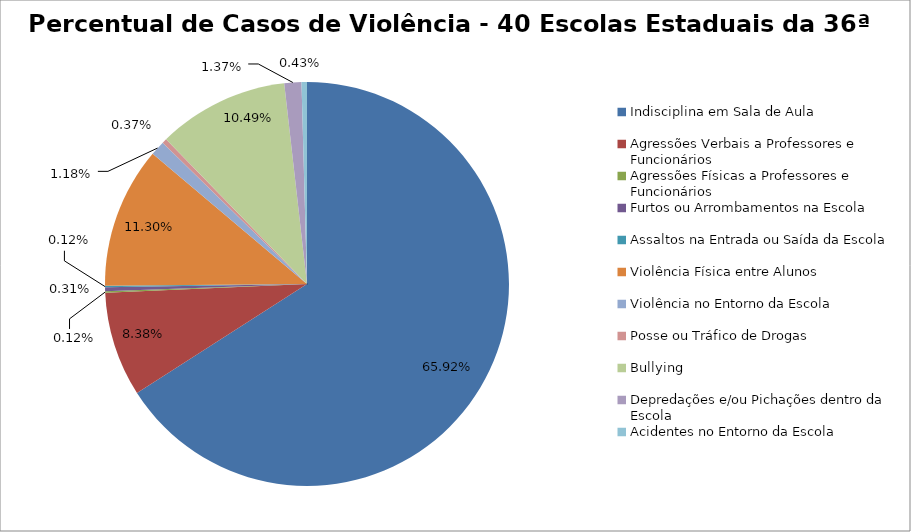
| Category | Percentual |
|---|---|
| Indisciplina em Sala de Aula | 0.659 |
| Agressões Verbais a Professores e Funcionários | 0.084 |
| Agressões Físicas a Professores e Funcionários | 0.001 |
| Furtos ou Arrombamentos na Escola | 0.003 |
| Assaltos na Entrada ou Saída da Escola | 0.001 |
| Violência Física entre Alunos | 0.113 |
| Violência no Entorno da Escola | 0.012 |
| Posse ou Tráfico de Drogas | 0.004 |
| Bullying | 0.105 |
| Depredações e/ou Pichações dentro da Escola | 0.014 |
| Acidentes no Entorno da Escola | 0.004 |